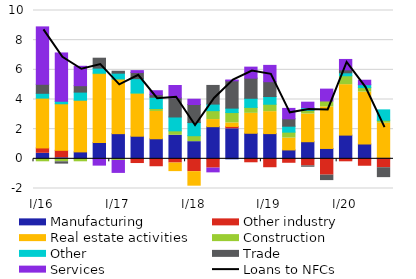
| Category | Manufacturing | Other industry | Real estate activities | Construction | Other | Trade | Services |
|---|---|---|---|---|---|---|---|
| I/16 | 0.372 | 0.362 | 3.359 | -0.2 | 0.325 | 0.608 | 3.869 |
| II | 0.072 | 0.502 | 3.138 | -0.2 | 0.17 | -0.089 | 3.256 |
| III | 0.454 | 0.013 | 3.483 | -0.2 | 0.549 | 0.432 | 1.308 |
| IV | 1.093 | 0.006 | 4.578 | 0.1 | 0.338 | 0.669 | -0.424 |
| I/17 | 1.697 | -0.007 | 3.685 | -0.1 | 0.393 | 0.129 | -0.807 |
| II | 1.525 | -0.317 | 2.819 | 0.1 | 0.964 | 0.413 | 0.125 |
| III | 1.353 | -0.534 | 1.841 | 0.2 | 0.758 | 0.173 | 0.267 |
| IV | 1.588 | -0.285 | -0.51 | 0.3 | 0.934 | 1.291 | 0.831 |
| I/18 | 1.158 | -0.865 | -0.911 | 0.4 | 0.888 | 1.216 | 0.357 |
| II | 2.167 | -0.624 | 0.481 | 0.6 | 0.442 | 1.258 | -0.254 |
| III | 2.025 | 0.159 | 0.235 | 0.7 | 0.299 | 1.841 | 0.054 |
| IV | 1.724 | -0.266 | 1.343 | 0.4 | 0.615 | 1.358 | 0.742 |
| I/19 | 1.7 | -0.6 | 1.481 | 0.5 | 0.519 | 1 | 1.1 |
| II | 0.6 | -0.3 | 0.8 | 0.4 | 0.4 | 0.5 | 0.7 |
| III | 1.154 | -0.475 | 1.869 | 0.244 | 0.181 | -0.024 | 0.372 |
| IV | 0.7 | -1.1 | 2.8 | 0.4 | 0 | -0.3 | 0.8 |
| I/20 | 1.6 | -0.2 | 3.4 | 0.6 | 0.2 | 0.2 | 0.7 |
| II | 1 | -0.5 | 3.5 | 0.3 | 0.2 | 0 | 0.3 |
| III | 0.1 | -0.6 | 2.3 | 0.2 | 0.7 | -0.6 | 0 |